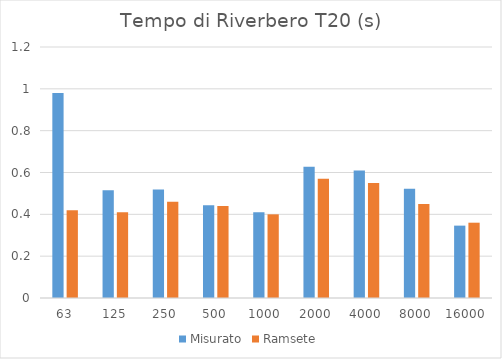
| Category | Misurato | Ramsete |
|---|---|---|
| 63.0 | 0.98 | 0.42 |
| 125.0 | 0.515 | 0.41 |
| 250.0 | 0.519 | 0.46 |
| 500.0 | 0.443 | 0.44 |
| 1000.0 | 0.41 | 0.4 |
| 2000.0 | 0.627 | 0.57 |
| 4000.0 | 0.609 | 0.55 |
| 8000.0 | 0.522 | 0.45 |
| 16000.0 | 0.346 | 0.36 |